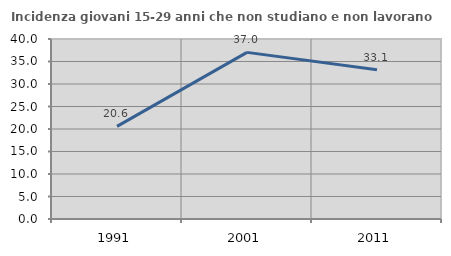
| Category | Incidenza giovani 15-29 anni che non studiano e non lavorano  |
|---|---|
| 1991.0 | 20.582 |
| 2001.0 | 37.026 |
| 2011.0 | 33.147 |